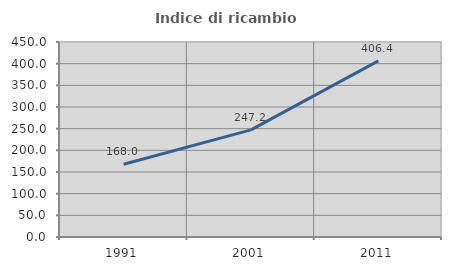
| Category | Indice di ricambio occupazionale  |
|---|---|
| 1991.0 | 168.04 |
| 2001.0 | 247.17 |
| 2011.0 | 406.405 |